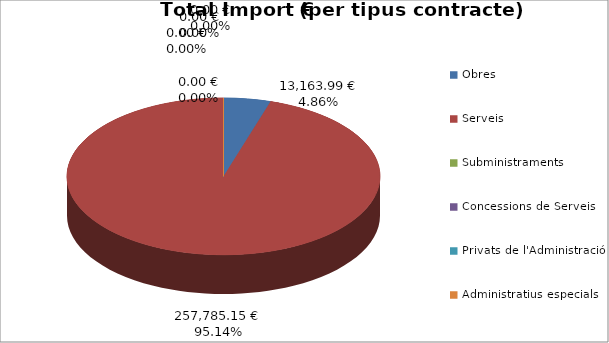
| Category | Total preu              (amb iva) |
|---|---|
| Obres | 13163.99 |
| Serveis | 257785.15 |
| Subministraments | 0 |
| Concessions de Serveis | 0 |
| Privats de l'Administració | 0 |
| Administratius especials | 0 |